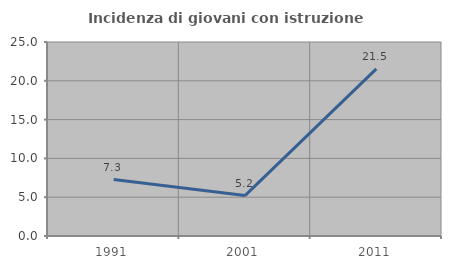
| Category | Incidenza di giovani con istruzione universitaria |
|---|---|
| 1991.0 | 7.273 |
| 2001.0 | 5.208 |
| 2011.0 | 21.538 |